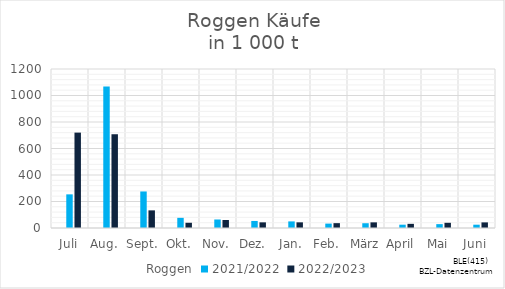
| Category | Roggen | 2021/2022 | 2022/2023 |
|---|---|---|---|
| Juli |  | 253.908 | 719.908 |
| Aug. |  | 1068.198 | 707.622 |
| Sept. |  | 275.689 | 133.102 |
| Okt. |  | 76.628 | 39.448 |
| Nov. |  | 64.224 | 60.462 |
| Dez. |  | 53.186 | 42.672 |
| Jan. |  | 49.783 | 42.719 |
| Feb. |  | 33.216 | 36.579 |
| März |  | 35.989 | 42.582 |
| April |  | 24.99 | 31.376 |
| Mai |  | 29.164 | 39.219 |
| Juni |  | 25.027 | 42.336 |